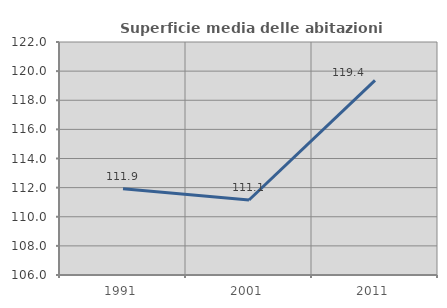
| Category | Superficie media delle abitazioni occupate |
|---|---|
| 1991.0 | 111.92 |
| 2001.0 | 111.15 |
| 2011.0 | 119.359 |